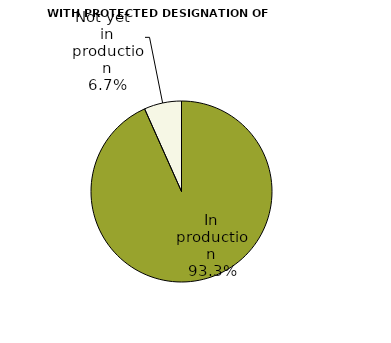
| Category | Series 0 |
|---|---|
| In production | 16365.386 |
| Not yet in production | 1172.332 |